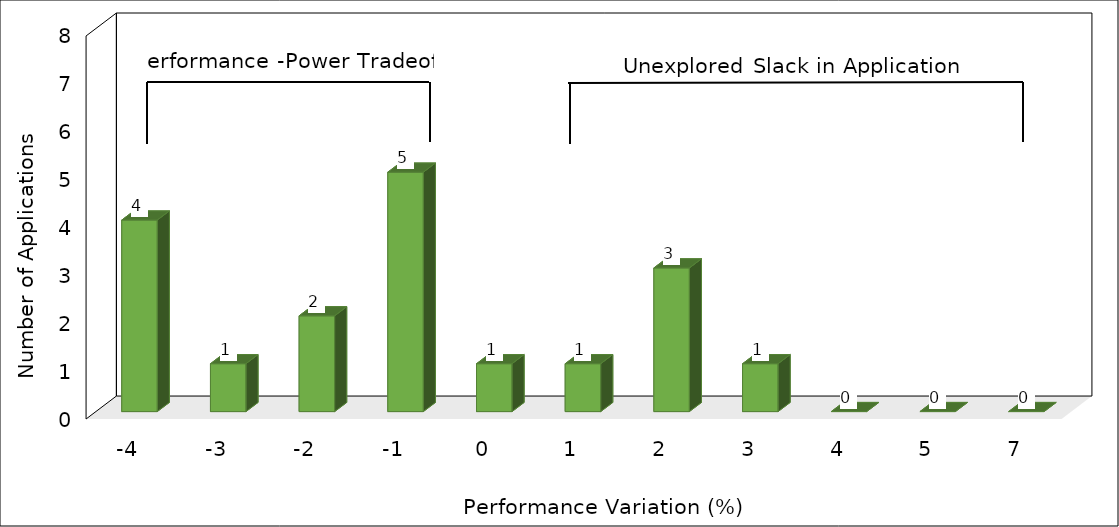
| Category | Series 0 |
|---|---|
| -4.0 | 4 |
| -3.0 | 1 |
| -2.0 | 2 |
| -1.0 | 5 |
| 0.0 | 1 |
| 1.0 | 1 |
| 2.0 | 3 |
| 3.0 | 1 |
| 4.0 | 0 |
| 5.0 | 0 |
| 7.0 | 0 |